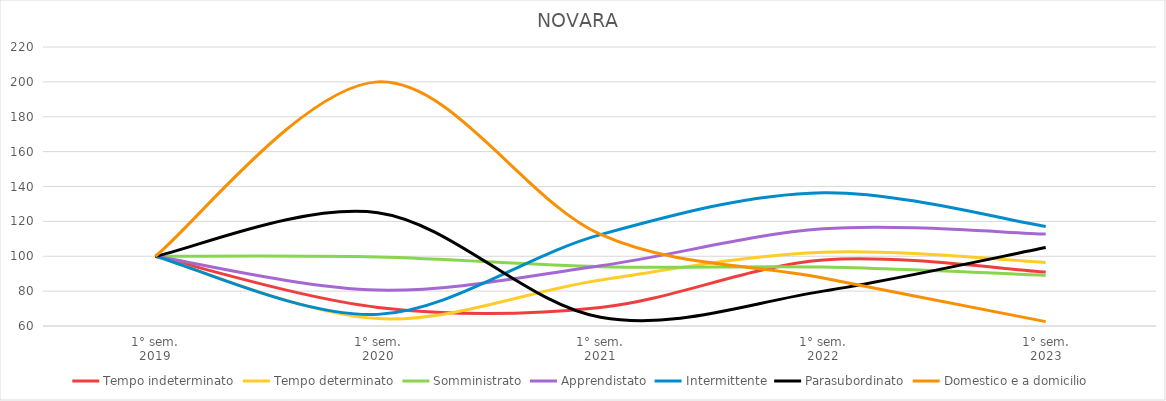
| Category | Tempo indeterminato | Tempo determinato | Somministrato | Apprendistato | Intermittente | Parasubordinato | Domestico e a domicilio |
|---|---|---|---|---|---|---|---|
| 1° sem.
2019 | 100 | 100 | 100 | 100 | 100 | 100 | 100 |
| 1° sem.
2020 | 70.656 | 64.242 | 99.574 | 80.606 | 66.667 | 125 | 200 |
| 1° sem.
2021 | 70.656 | 86.404 | 94.03 | 94.545 | 112.403 | 65 | 112.5 |
| 1° sem.
2022 | 97.876 | 102.311 | 93.817 | 115.758 | 136.434 | 80 | 87.5 |
| 1° sem.
2023 | 90.927 | 96.465 | 89.126 | 112.727 | 117.054 | 105 | 62.5 |